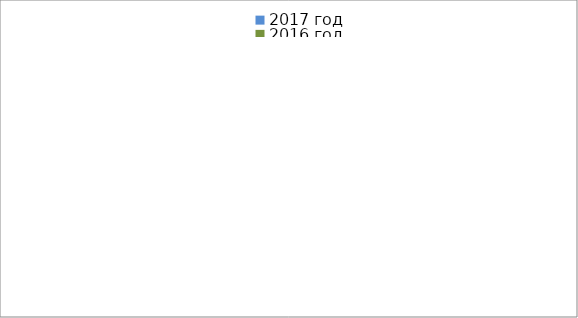
| Category | 2017 год | 2016 год |
|---|---|---|
|  - поджог | 22 | 43 |
|  - неосторожное обращение с огнём | 6 | 23 |
|  - НПТЭ электрооборудования | 30 | 28 |
|  - НПУ и Э печей | 54 | 44 |
|  - НПУ и Э транспортных средств | 50 | 53 |
|   -Шалость с огнем детей | 4 | 6 |
|  -НППБ при эксплуатации эл.приборов | 37 | 34 |
|  - курение | 49 | 37 |
| - прочие | 88 | 104 |
| - не установленные причины | 0 | 12 |